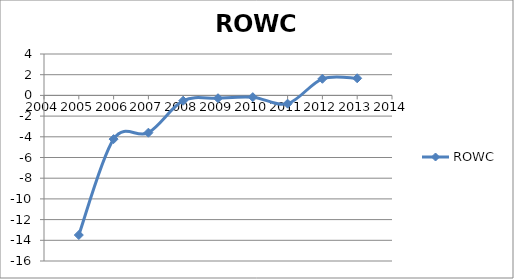
| Category | ROWC |
|---|---|
| 2005.0 | -13.492 |
| 2006.0 | -4.224 |
| 2007.0 | -3.603 |
| 2008.0 | -0.514 |
| 2009.0 | -0.274 |
| 2010.0 | -0.168 |
| 2011.0 | -0.798 |
| 2012.0 | 1.605 |
| 2013.0 | 1.655 |